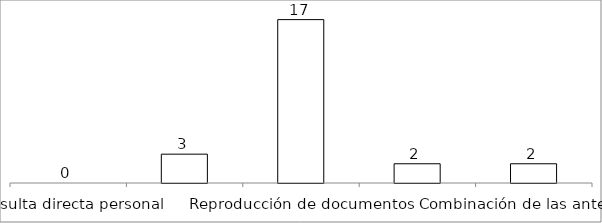
| Category | Series 0 |
|---|---|
| Consulta directa personal | 0 |
| Consulta directa electrónica | 3 |
| Reproducción de documentos | 17 |
| Elaboración de informes | 2 |
| Combinación de las anteriores | 2 |